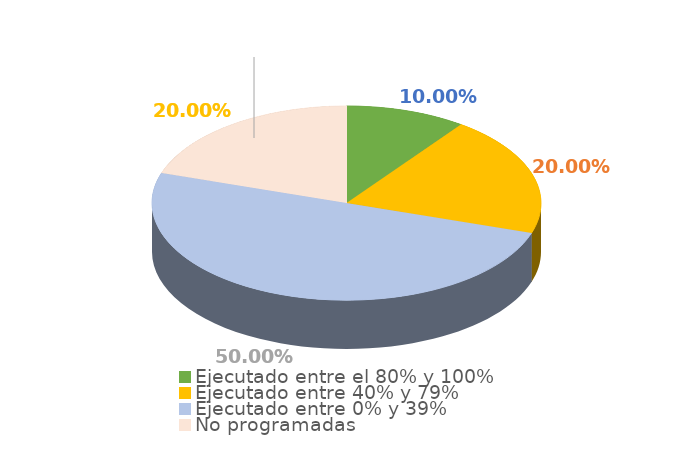
| Category | Series 0 |
|---|---|
| Ejecutado entre el 80% y 100% | 0.1 |
| Ejecutado entre 40% y 79% | 0.2 |
| Ejecutado entre 0% y 39% | 0.5 |
| No programadas | 0.2 |